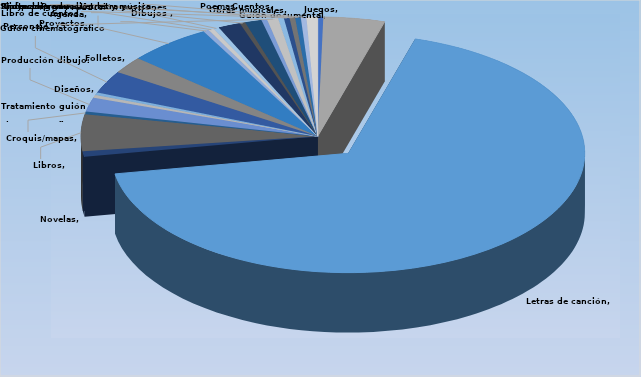
| Category | Series 0 |
|---|---|
| Juegos | 1 |
| Obras musicales | 11 |
| Letras de canción | 178 |
| Novelas | 2 |
| Libros | 13 |
| Croquis/mapas | 1 |
| Producción dibujos | 5 |
| Tratamiento guión 
cinematográfico | 1 |
| Diseños | 1 |
| Guion cinematográfico | 8 |
| Folletos | 6 |
| Producción canciones | 15 |
| Proyectos arquitectónicos | 1 |
| Agenda | 1 |
| Sinopsis/argumento | 1 |
| Cuentos | 4 |
| Software | 1 |
| Dibujos  | 3 |
| Guión documental | 1 |
| Personaje  | 2 |
| Poemas | 1 |
| Proyecto general | 1 |
| Libro de cuentos | 1 |
| Video clip  | 1 |
| Producción letra y música | 1 |
| Letras y música  | 2 |